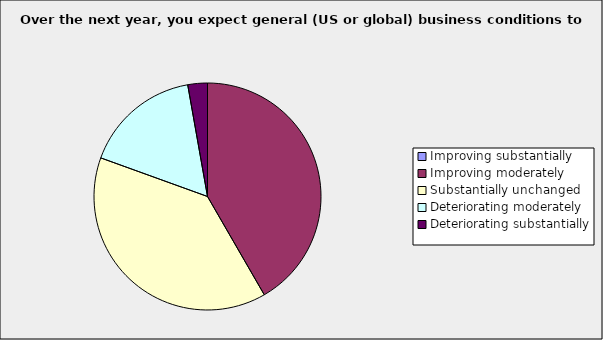
| Category | Series 0 |
|---|---|
| Improving substantially | 0 |
| Improving moderately | 0.417 |
| Substantially unchanged | 0.389 |
| Deteriorating moderately | 0.167 |
| Deteriorating substantially | 0.028 |